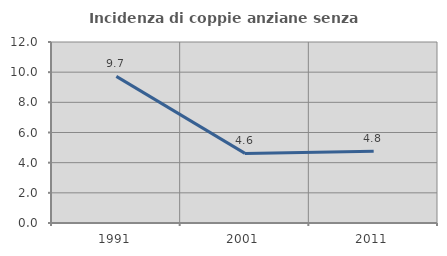
| Category | Incidenza di coppie anziane senza figli  |
|---|---|
| 1991.0 | 9.722 |
| 2001.0 | 4.615 |
| 2011.0 | 4.762 |